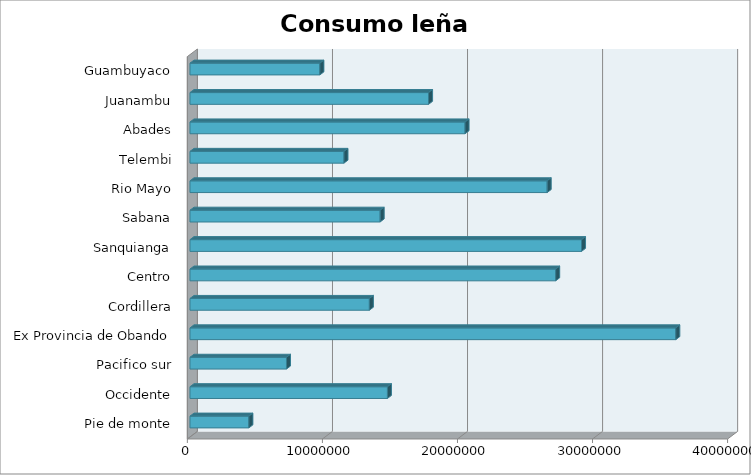
| Category | Series 0 |
|---|---|
| Pie de monte | 4359209.956 |
| Occidente | 14618575.091 |
| Pacifico sur | 7144279.739 |
| Ex Provincia de Obando | 35969191.094 |
| Cordillera | 13280918.57 |
| Centro | 27075938.821 |
| Sanquianga | 28988438.987 |
| Sabana | 14078155.34 |
| Rio Mayo | 26444462.78 |
| Telembi | 11399896.213 |
| Abades | 20365063.04 |
| Juanambu | 17663616.999 |
| Guambuyaco | 9615277.32 |